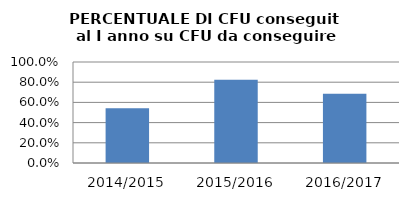
| Category | 2014/2015 2015/2016 2016/2017 |
|---|---|
| 2014/2015 | 0.543 |
| 2015/2016 | 0.823 |
| 2016/2017 | 0.686 |